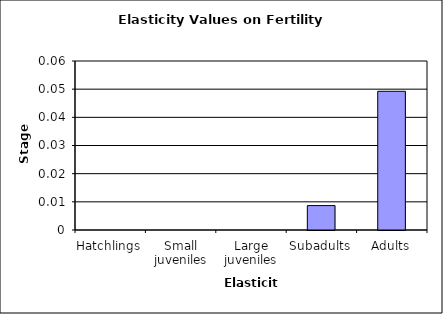
| Category | Series 0 |
|---|---|
| Hatchlings | 0 |
| Small juveniles | 0 |
| Large juveniles | 0 |
| Subadults | 0.009 |
| Adults | 0.049 |